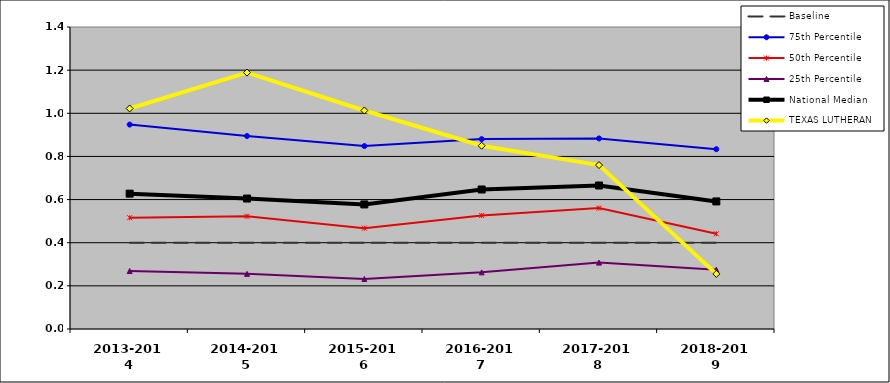
| Category | Baseline | 75th Percentile | 50th Percentile | 25th Percentile | National Median | TEXAS LUTHERAN |
|---|---|---|---|---|---|---|
| 2013-2014 | 0.4 | 0.948 | 0.516 | 0.269 | 0.627 | 1.022 |
| 2014-2015 | 0.4 | 0.895 | 0.522 | 0.256 | 0.605 | 1.189 |
| 2015-2016 | 0.4 | 0.848 | 0.468 | 0.232 | 0.577 | 1.013 |
| 2016-2017 | 0.4 | 0.88 | 0.526 | 0.263 | 0.647 | 0.849 |
| 2017-2018 | 0.4 | 0.883 | 0.56 | 0.308 | 0.665 | 0.76 |
| 2018-2019 | 0.4 | 0.834 | 0.441 | 0.275 | 0.591 | 0.255 |